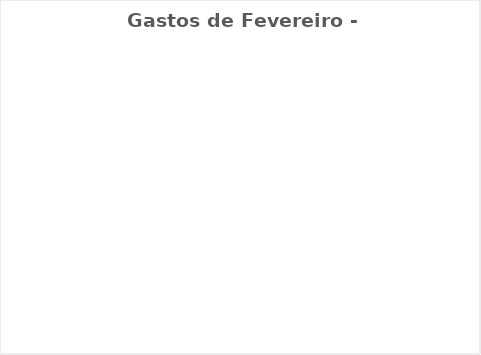
| Category | Gastos de Fevereiro - Real |
|---|---|
| Despesas Mensais | 0 |
| Aposentadoria/Pagar à si | 0 |
| Gratidão/ Doação/ Dizimo | 0 |
| Desejos | 0 |
| Dívidas/Investimentos | 0 |